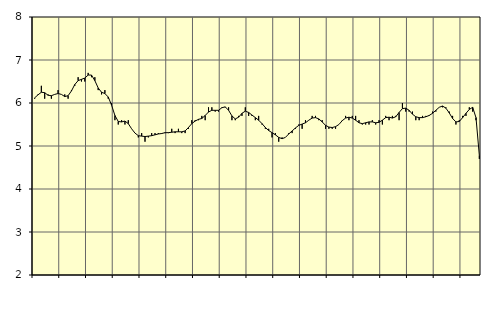
| Category | Piggar | Transport, SNI 49-53 |
|---|---|---|
| nan | 6.1 | 6.12 |
| 87.0 | 6.2 | 6.19 |
| 87.0 | 6.4 | 6.25 |
| 87.0 | 6.1 | 6.24 |
| nan | 6.2 | 6.18 |
| 88.0 | 6.1 | 6.17 |
| 88.0 | 6.2 | 6.2 |
| 88.0 | 6.3 | 6.22 |
| nan | 6.2 | 6.2 |
| 89.0 | 6.2 | 6.15 |
| 89.0 | 6.1 | 6.17 |
| 89.0 | 6.3 | 6.28 |
| nan | 6.4 | 6.43 |
| 90.0 | 6.6 | 6.52 |
| 90.0 | 6.5 | 6.55 |
| 90.0 | 6.5 | 6.58 |
| nan | 6.7 | 6.65 |
| 91.0 | 6.6 | 6.65 |
| 91.0 | 6.6 | 6.52 |
| 91.0 | 6.3 | 6.35 |
| nan | 6.2 | 6.25 |
| 92.0 | 6.3 | 6.22 |
| 92.0 | 6.1 | 6.14 |
| 92.0 | 6 | 5.95 |
| nan | 5.6 | 5.71 |
| 93.0 | 5.5 | 5.57 |
| 93.0 | 5.6 | 5.56 |
| 93.0 | 5.5 | 5.58 |
| nan | 5.6 | 5.52 |
| 94.0 | 5.4 | 5.4 |
| 94.0 | 5.3 | 5.3 |
| 94.0 | 5.2 | 5.24 |
| nan | 5.3 | 5.23 |
| 95.0 | 5.1 | 5.22 |
| 95.0 | 5.2 | 5.23 |
| 95.0 | 5.3 | 5.24 |
| nan | 5.3 | 5.26 |
| 96.0 | 5.3 | 5.28 |
| 96.0 | 5.3 | 5.29 |
| 96.0 | 5.3 | 5.31 |
| nan | 5.3 | 5.31 |
| 97.0 | 5.4 | 5.32 |
| 97.0 | 5.3 | 5.33 |
| 97.0 | 5.4 | 5.33 |
| nan | 5.3 | 5.33 |
| 98.0 | 5.3 | 5.35 |
| 98.0 | 5.4 | 5.43 |
| 98.0 | 5.6 | 5.52 |
| nan | 5.6 | 5.58 |
| 99.0 | 5.6 | 5.62 |
| 99.0 | 5.7 | 5.64 |
| 99.0 | 5.6 | 5.71 |
| nan | 5.9 | 5.79 |
| 0.0 | 5.9 | 5.83 |
| 0.0 | 5.8 | 5.83 |
| 0.0 | 5.8 | 5.83 |
| nan | 5.9 | 5.89 |
| 1.0 | 5.9 | 5.91 |
| 1.0 | 5.9 | 5.83 |
| 1.0 | 5.6 | 5.7 |
| nan | 5.6 | 5.63 |
| 2.0 | 5.7 | 5.67 |
| 2.0 | 5.7 | 5.76 |
| 2.0 | 5.9 | 5.81 |
| nan | 5.7 | 5.78 |
| 3.0 | 5.7 | 5.72 |
| 3.0 | 5.6 | 5.66 |
| 3.0 | 5.7 | 5.6 |
| nan | 5.5 | 5.52 |
| 4.0 | 5.4 | 5.43 |
| 4.0 | 5.4 | 5.36 |
| 4.0 | 5.2 | 5.31 |
| nan | 5.3 | 5.26 |
| 5.0 | 5.1 | 5.2 |
| 5.0 | 5.2 | 5.17 |
| 5.0 | 5.2 | 5.2 |
| nan | 5.3 | 5.28 |
| 6.0 | 5.3 | 5.35 |
| 6.0 | 5.4 | 5.42 |
| 6.0 | 5.5 | 5.48 |
| nan | 5.4 | 5.51 |
| 7.0 | 5.6 | 5.54 |
| 7.0 | 5.6 | 5.6 |
| 7.0 | 5.7 | 5.65 |
| nan | 5.7 | 5.66 |
| 8.0 | 5.6 | 5.63 |
| 8.0 | 5.6 | 5.56 |
| 8.0 | 5.4 | 5.48 |
| nan | 5.4 | 5.44 |
| 9.0 | 5.4 | 5.43 |
| 9.0 | 5.4 | 5.45 |
| 9.0 | 5.5 | 5.5 |
| nan | 5.6 | 5.59 |
| 10.0 | 5.7 | 5.65 |
| 10.0 | 5.6 | 5.67 |
| 10.0 | 5.7 | 5.65 |
| nan | 5.7 | 5.6 |
| 11.0 | 5.6 | 5.54 |
| 11.0 | 5.5 | 5.52 |
| 11.0 | 5.5 | 5.54 |
| nan | 5.5 | 5.56 |
| 12.0 | 5.6 | 5.56 |
| 12.0 | 5.5 | 5.54 |
| 12.0 | 5.6 | 5.55 |
| nan | 5.5 | 5.6 |
| 13.0 | 5.7 | 5.66 |
| 13.0 | 5.6 | 5.67 |
| 13.0 | 5.7 | 5.65 |
| nan | 5.7 | 5.68 |
| 14.0 | 5.6 | 5.78 |
| 14.0 | 6 | 5.87 |
| 14.0 | 5.8 | 5.88 |
| nan | 5.8 | 5.83 |
| 15.0 | 5.8 | 5.74 |
| 15.0 | 5.6 | 5.68 |
| 15.0 | 5.6 | 5.66 |
| nan | 5.7 | 5.66 |
| 16.0 | 5.7 | 5.68 |
| 16.0 | 5.7 | 5.71 |
| 16.0 | 5.8 | 5.76 |
| nan | 5.8 | 5.83 |
| 17.0 | 5.9 | 5.9 |
| 17.0 | 5.9 | 5.93 |
| 17.0 | 5.9 | 5.88 |
| nan | 5.8 | 5.77 |
| 18.0 | 5.7 | 5.64 |
| 18.0 | 5.5 | 5.56 |
| 18.0 | 5.6 | 5.57 |
| nan | 5.7 | 5.66 |
| 19.0 | 5.7 | 5.76 |
| 19.0 | 5.9 | 5.85 |
| 19.0 | 5.8 | 5.9 |
| nan | 5.6 | 5.66 |
| 20.0 | 4.7 | 4.78 |